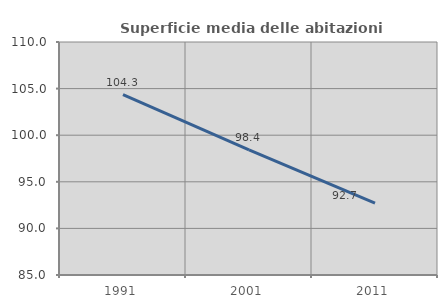
| Category | Superficie media delle abitazioni occupate |
|---|---|
| 1991.0 | 104.345 |
| 2001.0 | 98.432 |
| 2011.0 | 92.705 |